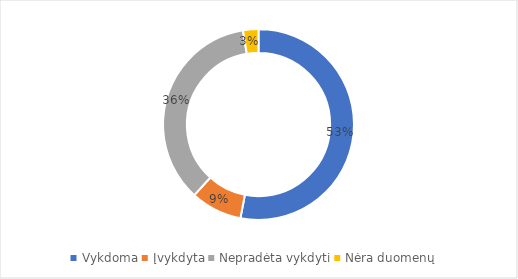
| Category | Proc. nuo visų |
|---|---|
| Vykdoma | 0.53 |
| Įvykdyta | 0.087 |
| Nepradėta vykdyti | 0.357 |
| Nėra duomenų | 0.026 |